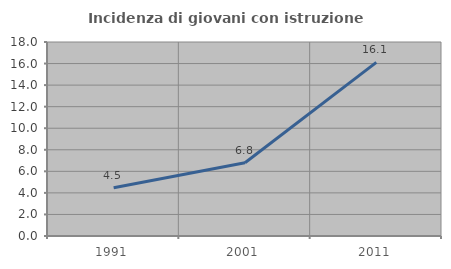
| Category | Incidenza di giovani con istruzione universitaria |
|---|---|
| 1991.0 | 4.482 |
| 2001.0 | 6.799 |
| 2011.0 | 16.105 |